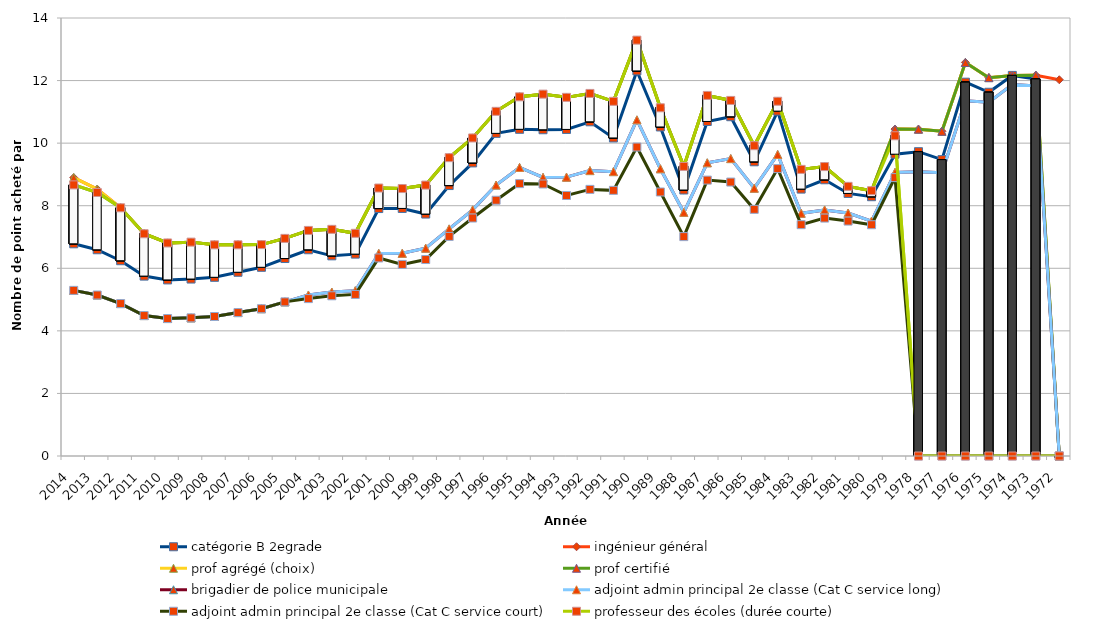
| Category | catégorie B 2egrade | ingénieur général | prof agrégé (choix) | prof certifié | brigadier de police municipale | adjoint admin principal 2e classe (Cat C service long) | adjoint admin principal 2e classe (Cat C service court) | professeur des écoles (durée courte) |
|---|---|---|---|---|---|---|---|---|
|  | 6.782 | 8.9 | 8.9 | 8.666 | 5.294 | 5.294 | 5.294 | 8.666 |
|  | 6.592 | 8.531 | 8.531 | 8.423 | 5.146 | 5.146 | 5.146 | 8.423 |
|  | 6.242 | 7.934 | 7.934 | 7.934 | 4.872 | 4.872 | 4.872 | 7.934 |
|  | 5.75 | 7.104 | 7.104 | 7.104 | 4.489 | 4.489 | 4.489 | 7.104 |
|  | 5.628 | 6.81 | 6.81 | 6.81 | 4.393 | 4.393 | 4.393 | 6.81 |
|  | 5.656 | 6.836 | 6.836 | 6.836 | 4.415 | 4.415 | 4.415 | 6.836 |
|  | 5.712 | 6.75 | 6.75 | 6.75 | 4.459 | 4.459 | 4.459 | 6.75 |
|  | 5.873 | 6.75 | 6.75 | 6.75 | 4.585 | 4.585 | 4.585 | 6.75 |
|  | 6.031 | 6.757 | 6.757 | 6.757 | 4.708 | 4.708 | 4.708 | 6.757 |
|  | 6.312 | 6.956 | 6.956 | 6.956 | 4.927 | 4.927 | 4.927 | 6.956 |
|  | 6.593 | 7.21 | 7.21 | 7.21 | 5.146 | 5.146 | 5.031 | 7.21 |
|  | 6.398 | 7.245 | 7.245 | 7.245 | 5.238 | 5.238 | 5.121 | 7.245 |
|  | 6.453 | 7.118 | 7.118 | 7.118 | 5.283 | 5.283 | 5.165 | 7.118 |
|  | 7.909 | 8.565 | 8.565 | 8.565 | 6.475 | 6.475 | 6.33 | 8.565 |
|  | 7.913 | 8.549 | 8.549 | 8.549 | 6.479 | 6.479 | 6.124 | 8.549 |
|  | 7.734 | 8.659 | 8.659 | 8.659 | 6.643 | 6.643 | 6.279 | 8.659 |
|  | 8.644 | 9.536 | 9.536 | 9.536 | 7.259 | 7.259 | 7.019 | 9.536 |
|  | 9.368 | 10.166 | 10.166 | 10.166 | 7.867 | 7.867 | 7.607 | 10.166 |
|  | 10.312 | 11.017 | 11.017 | 11.017 | 8.66 | 8.66 | 8.175 | 11.017 |
|  | 10.442 | 11.48 | 11.48 | 11.48 | 9.222 | 9.222 | 8.706 | 11.48 |
|  | 10.428 | 11.566 | 11.566 | 11.566 | 8.905 | 8.905 | 8.694 | 11.566 |
|  | 10.439 | 11.463 | 11.463 | 11.463 | 8.914 | 8.914 | 8.327 | 11.463 |
|  | 10.682 | 11.589 | 11.589 | 11.589 | 9.122 | 9.122 | 8.522 | 11.589 |
|  | 10.166 | 11.336 | 11.336 | 11.336 | 9.089 | 9.089 | 8.491 | 11.336 |
|  | 12.308 | 13.293 | 13.293 | 13.293 | 10.744 | 10.744 | 9.876 | 13.293 |
|  | 10.517 | 11.13 | 11.13 | 11.13 | 9.181 | 9.181 | 8.438 | 11.13 |
|  | 8.503 | 9.256 | 9.256 | 9.256 | 7.789 | 7.789 | 7.012 | 9.256 |
|  | 10.693 | 11.525 | 11.525 | 11.525 | 9.372 | 9.372 | 8.818 | 11.525 |
|  | 10.845 | 11.365 | 11.365 | 11.365 | 9.506 | 9.506 | 8.756 | 11.365 |
|  | 9.404 | 9.918 | 9.918 | 9.918 | 8.56 | 8.56 | 7.885 | 9.918 |
|  | 11.023 | 11.339 | 11.339 | 11.339 | 9.638 | 9.638 | 9.186 | 11.339 |
|  | 8.532 | 9.161 | 9.161 | 9.161 | 7.758 | 7.758 | 7.394 | 9.161 |
|  | 8.829 | 9.251 | 9.251 | 9.251 | 7.864 | 7.864 | 7.605 | 9.251 |
|  | 8.393 | 8.619 | 8.619 | 8.619 | 7.765 | 7.765 | 7.509 | 8.619 |
|  | 8.288 | 8.48 | 8.48 | 8.48 | 7.507 | 7.507 | 7.392 | 8.48 |
|  | 9.647 | 10.45 | 10.45 | 10.45 | 9.065 | 9.065 | 8.898 | 10.236 |
|  | 9.727 | 10.447 | 10.447 | 10.447 | 9.084 | 9.084 | 0 | 0 |
|  | 9.473 | 10.38 | 10.38 | 10.38 | 9.055 | 9.055 | 0 | 0 |
|  | 11.949 | 12.579 | 12.579 | 12.579 | 11.352 | 11.352 | 0 | 0 |
|  | 11.626 | 12.093 | 12.093 | 12.093 | 11.311 | 11.311 | 0 | 0 |
|  | 12.165 | 12.165 | 12.165 | 12.165 | 11.875 | 11.875 | 0 | 0 |
|  | 12.052 | 12.173 | 12.173 | 12.173 | 11.83 | 11.83 | 0 | 0 |
|  | 0 | 12.026 | 0 | 0 | 0 | 0 | 0 | 0 |